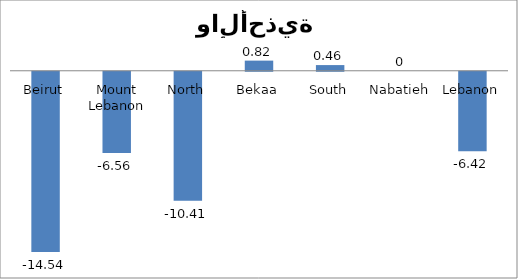
| Category | 03 |
|---|---|
| Beirut | -14.54 |
| Mount Lebanon | -6.56 |
| North | -10.41 |
| Bekaa | 0.82 |
| South | 0.46 |
| Nabatieh | 0 |
| Lebanon | -6.42 |